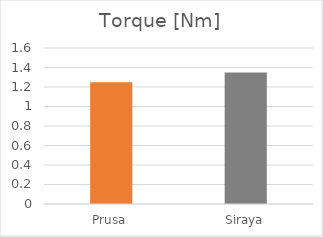
| Category | Torque [Nm] |
|---|---|
| Prusa | 1.25 |
| Siraya | 1.35 |